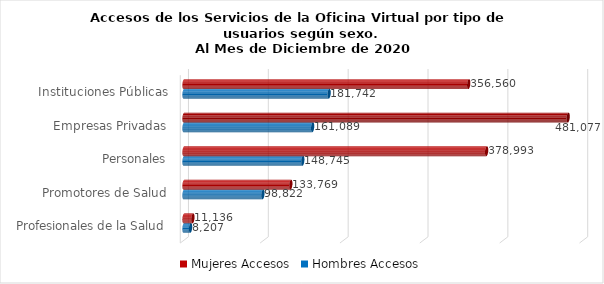
| Category | Mujeres | Hombres |
|---|---|---|
| Instituciones Públicas | 356560 | 181742 |
| Empresas Privadas | 481077 | 161089 |
| Personales | 378993 | 148745 |
| Promotores de Salud | 133769 | 98822 |
| Profesionales de la Salud | 11136 | 8207 |